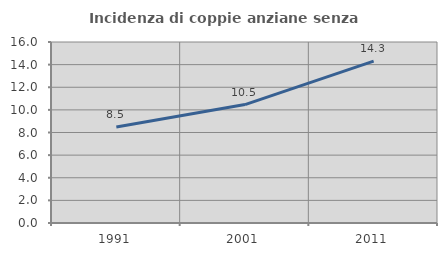
| Category | Incidenza di coppie anziane senza figli  |
|---|---|
| 1991.0 | 8.489 |
| 2001.0 | 10.469 |
| 2011.0 | 14.309 |